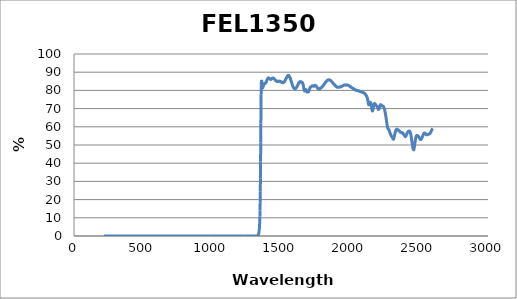
| Category | Series 0 |
|---|---|
| 2600.0 | 59.08 |
| 2599.0 | 58.998 |
| 2598.0 | 58.89 |
| 2597.0 | 58.739 |
| 2596.0 | 58.732 |
| 2595.0 | 58.584 |
| 2594.0 | 58.423 |
| 2593.0 | 58.356 |
| 2592.0 | 58.157 |
| 2591.0 | 58.032 |
| 2590.0 | 57.883 |
| 2589.0 | 57.701 |
| 2588.0 | 57.541 |
| 2587.0 | 57.393 |
| 2586.0 | 57.198 |
| 2585.0 | 56.903 |
| 2584.0 | 56.845 |
| 2583.0 | 56.702 |
| 2582.0 | 56.532 |
| 2581.0 | 56.391 |
| 2580.0 | 56.338 |
| 2579.0 | 56.215 |
| 2578.0 | 56.128 |
| 2577.0 | 56.086 |
| 2576.0 | 56.096 |
| 2575.0 | 56.05 |
| 2574.0 | 55.998 |
| 2573.0 | 56.052 |
| 2572.0 | 56.052 |
| 2571.0 | 55.967 |
| 2570.0 | 55.991 |
| 2569.0 | 55.956 |
| 2568.0 | 55.953 |
| 2567.0 | 55.825 |
| 2566.0 | 55.834 |
| 2565.0 | 55.737 |
| 2564.0 | 55.673 |
| 2563.0 | 55.618 |
| 2562.0 | 55.721 |
| 2561.0 | 55.596 |
| 2560.0 | 55.57 |
| 2559.0 | 55.626 |
| 2558.0 | 55.591 |
| 2557.0 | 55.619 |
| 2556.0 | 55.607 |
| 2555.0 | 55.582 |
| 2554.0 | 55.66 |
| 2553.0 | 55.694 |
| 2552.0 | 55.776 |
| 2551.0 | 55.855 |
| 2550.0 | 55.943 |
| 2549.0 | 56.063 |
| 2548.0 | 56.208 |
| 2547.0 | 56.269 |
| 2546.0 | 56.344 |
| 2545.0 | 56.361 |
| 2544.0 | 56.423 |
| 2543.0 | 56.454 |
| 2542.0 | 56.578 |
| 2541.0 | 56.522 |
| 2540.0 | 56.527 |
| 2539.0 | 56.511 |
| 2538.0 | 56.524 |
| 2537.0 | 56.357 |
| 2536.0 | 56.397 |
| 2535.0 | 56.24 |
| 2534.0 | 56.103 |
| 2533.0 | 55.975 |
| 2532.0 | 55.994 |
| 2531.0 | 55.673 |
| 2530.0 | 55.518 |
| 2529.0 | 55.333 |
| 2528.0 | 55.132 |
| 2527.0 | 54.967 |
| 2526.0 | 54.809 |
| 2525.0 | 54.567 |
| 2524.0 | 54.397 |
| 2523.0 | 54.203 |
| 2522.0 | 54.044 |
| 2521.0 | 53.843 |
| 2520.0 | 53.65 |
| 2519.0 | 53.543 |
| 2518.0 | 53.363 |
| 2517.0 | 53.265 |
| 2516.0 | 53.142 |
| 2515.0 | 53.128 |
| 2514.0 | 52.998 |
| 2513.0 | 52.995 |
| 2512.0 | 53.062 |
| 2511.0 | 53.072 |
| 2510.0 | 53.024 |
| 2509.0 | 53.196 |
| 2508.0 | 53.247 |
| 2507.0 | 53.301 |
| 2506.0 | 53.443 |
| 2505.0 | 53.642 |
| 2504.0 | 53.713 |
| 2503.0 | 53.88 |
| 2502.0 | 54.003 |
| 2501.0 | 54.151 |
| 2500.0 | 54.252 |
| 2499.0 | 54.462 |
| 2498.0 | 54.479 |
| 2497.0 | 54.494 |
| 2496.0 | 54.653 |
| 2495.0 | 54.744 |
| 2494.0 | 54.746 |
| 2493.0 | 54.863 |
| 2492.0 | 54.967 |
| 2491.0 | 54.987 |
| 2490.0 | 55.009 |
| 2489.0 | 55.04 |
| 2488.0 | 55.151 |
| 2487.0 | 55.133 |
| 2486.0 | 55.208 |
| 2485.0 | 55.249 |
| 2484.0 | 55.218 |
| 2483.0 | 55.239 |
| 2482.0 | 55.121 |
| 2481.0 | 54.965 |
| 2480.0 | 54.857 |
| 2479.0 | 54.671 |
| 2478.0 | 54.383 |
| 2477.0 | 54.024 |
| 2476.0 | 53.673 |
| 2475.0 | 53.316 |
| 2474.0 | 52.816 |
| 2473.0 | 52.386 |
| 2472.0 | 51.907 |
| 2471.0 | 51.385 |
| 2470.0 | 50.871 |
| 2469.0 | 50.351 |
| 2468.0 | 49.699 |
| 2467.0 | 49.206 |
| 2466.0 | 48.757 |
| 2465.0 | 48.279 |
| 2464.0 | 47.858 |
| 2463.0 | 47.6 |
| 2462.0 | 47.439 |
| 2461.0 | 47.316 |
| 2460.0 | 47.384 |
| 2459.0 | 47.467 |
| 2458.0 | 47.709 |
| 2457.0 | 47.986 |
| 2456.0 | 48.345 |
| 2455.0 | 48.731 |
| 2454.0 | 49.183 |
| 2453.0 | 49.575 |
| 2452.0 | 50.059 |
| 2451.0 | 50.507 |
| 2450.0 | 51.056 |
| 2449.0 | 51.544 |
| 2448.0 | 52.054 |
| 2447.0 | 52.669 |
| 2446.0 | 53.086 |
| 2445.0 | 53.676 |
| 2444.0 | 54.155 |
| 2443.0 | 54.662 |
| 2442.0 | 55.085 |
| 2441.0 | 55.628 |
| 2440.0 | 55.973 |
| 2439.0 | 56.266 |
| 2438.0 | 56.589 |
| 2437.0 | 56.837 |
| 2436.0 | 56.959 |
| 2435.0 | 57.193 |
| 2434.0 | 57.366 |
| 2433.0 | 57.435 |
| 2432.0 | 57.477 |
| 2431.0 | 57.651 |
| 2430.0 | 57.554 |
| 2429.0 | 57.632 |
| 2428.0 | 57.688 |
| 2427.0 | 57.633 |
| 2426.0 | 57.532 |
| 2425.0 | 57.519 |
| 2424.0 | 57.449 |
| 2423.0 | 57.473 |
| 2422.0 | 57.356 |
| 2421.0 | 57.287 |
| 2420.0 | 57.161 |
| 2419.0 | 57.169 |
| 2418.0 | 57.008 |
| 2417.0 | 56.905 |
| 2416.0 | 56.818 |
| 2415.0 | 56.636 |
| 2414.0 | 56.464 |
| 2413.0 | 56.378 |
| 2412.0 | 56.252 |
| 2411.0 | 55.966 |
| 2410.0 | 55.765 |
| 2409.0 | 55.601 |
| 2408.0 | 55.36 |
| 2407.0 | 55.206 |
| 2406.0 | 55.034 |
| 2405.0 | 54.823 |
| 2404.0 | 54.762 |
| 2403.0 | 54.758 |
| 2402.0 | 54.606 |
| 2401.0 | 54.626 |
| 2400.0 | 54.759 |
| 2399.0 | 54.757 |
| 2398.0 | 54.826 |
| 2397.0 | 55.039 |
| 2396.0 | 55.105 |
| 2395.0 | 55.207 |
| 2394.0 | 55.368 |
| 2393.0 | 55.439 |
| 2392.0 | 55.473 |
| 2391.0 | 55.654 |
| 2390.0 | 55.697 |
| 2389.0 | 55.815 |
| 2388.0 | 55.918 |
| 2387.0 | 56.036 |
| 2386.0 | 56.025 |
| 2385.0 | 56.229 |
| 2384.0 | 56.36 |
| 2383.0 | 56.444 |
| 2382.0 | 56.583 |
| 2381.0 | 56.614 |
| 2380.0 | 56.64 |
| 2379.0 | 56.732 |
| 2378.0 | 56.728 |
| 2377.0 | 56.735 |
| 2376.0 | 56.827 |
| 2375.0 | 56.801 |
| 2374.0 | 56.763 |
| 2373.0 | 56.787 |
| 2372.0 | 56.759 |
| 2371.0 | 56.779 |
| 2370.0 | 56.847 |
| 2369.0 | 56.849 |
| 2368.0 | 56.871 |
| 2367.0 | 56.918 |
| 2366.0 | 56.978 |
| 2365.0 | 56.98 |
| 2364.0 | 57.125 |
| 2363.0 | 57.138 |
| 2362.0 | 57.322 |
| 2361.0 | 57.549 |
| 2360.0 | 57.591 |
| 2359.0 | 57.69 |
| 2358.0 | 57.821 |
| 2357.0 | 57.858 |
| 2356.0 | 57.951 |
| 2355.0 | 58.063 |
| 2354.0 | 58.008 |
| 2353.0 | 57.978 |
| 2352.0 | 58.069 |
| 2351.0 | 58.042 |
| 2350.0 | 58.04 |
| 2349.0 | 58.071 |
| 2348.0 | 58.071 |
| 2347.0 | 58.253 |
| 2346.0 | 58.362 |
| 2345.0 | 58.418 |
| 2344.0 | 58.416 |
| 2343.0 | 58.623 |
| 2342.0 | 58.605 |
| 2341.0 | 58.723 |
| 2340.0 | 58.75 |
| 2339.0 | 58.725 |
| 2338.0 | 58.627 |
| 2337.0 | 58.568 |
| 2336.0 | 58.468 |
| 2335.0 | 58.38 |
| 2334.0 | 58.271 |
| 2333.0 | 58.04 |
| 2332.0 | 57.912 |
| 2331.0 | 57.774 |
| 2330.0 | 57.429 |
| 2329.0 | 57.296 |
| 2328.0 | 57.086 |
| 2327.0 | 56.75 |
| 2326.0 | 56.537 |
| 2325.0 | 56.218 |
| 2324.0 | 55.95 |
| 2323.0 | 55.571 |
| 2322.0 | 55.213 |
| 2321.0 | 54.843 |
| 2320.0 | 54.405 |
| 2319.0 | 54.035 |
| 2318.0 | 53.629 |
| 2317.0 | 53.412 |
| 2316.0 | 53.283 |
| 2315.0 | 53.118 |
| 2314.0 | 53.136 |
| 2313.0 | 53.224 |
| 2312.0 | 53.272 |
| 2311.0 | 53.464 |
| 2310.0 | 53.692 |
| 2309.0 | 53.871 |
| 2308.0 | 54.096 |
| 2307.0 | 54.277 |
| 2306.0 | 54.322 |
| 2305.0 | 54.454 |
| 2304.0 | 54.565 |
| 2303.0 | 54.606 |
| 2302.0 | 54.622 |
| 2301.0 | 54.724 |
| 2300.0 | 54.883 |
| 2299.0 | 54.96 |
| 2298.0 | 55.14 |
| 2297.0 | 55.264 |
| 2296.0 | 55.474 |
| 2295.0 | 55.62 |
| 2294.0 | 55.876 |
| 2293.0 | 56.095 |
| 2292.0 | 56.32 |
| 2291.0 | 56.464 |
| 2290.0 | 56.661 |
| 2289.0 | 56.918 |
| 2288.0 | 57.043 |
| 2287.0 | 57.268 |
| 2286.0 | 57.557 |
| 2285.0 | 57.739 |
| 2284.0 | 57.981 |
| 2283.0 | 58.205 |
| 2282.0 | 58.319 |
| 2281.0 | 58.477 |
| 2280.0 | 58.555 |
| 2279.0 | 58.729 |
| 2278.0 | 58.724 |
| 2277.0 | 58.84 |
| 2276.0 | 58.892 |
| 2275.0 | 59.089 |
| 2274.0 | 59.252 |
| 2273.0 | 59.306 |
| 2272.0 | 59.713 |
| 2271.0 | 60.044 |
| 2270.0 | 60.431 |
| 2269.0 | 60.901 |
| 2268.0 | 61.445 |
| 2267.0 | 61.992 |
| 2266.0 | 62.46 |
| 2265.0 | 62.979 |
| 2264.0 | 63.509 |
| 2263.0 | 64.086 |
| 2262.0 | 64.629 |
| 2261.0 | 65.035 |
| 2260.0 | 65.577 |
| 2259.0 | 66.095 |
| 2258.0 | 66.543 |
| 2257.0 | 67.045 |
| 2256.0 | 67.435 |
| 2255.0 | 67.853 |
| 2254.0 | 68.217 |
| 2253.0 | 68.553 |
| 2252.0 | 68.901 |
| 2251.0 | 69.326 |
| 2250.0 | 69.617 |
| 2249.0 | 69.903 |
| 2248.0 | 70.182 |
| 2247.0 | 70.359 |
| 2246.0 | 70.544 |
| 2245.0 | 70.719 |
| 2244.0 | 70.915 |
| 2243.0 | 71.1 |
| 2242.0 | 71.116 |
| 2241.0 | 71.195 |
| 2240.0 | 71.291 |
| 2239.0 | 71.299 |
| 2238.0 | 71.284 |
| 2237.0 | 71.406 |
| 2236.0 | 71.417 |
| 2235.0 | 71.419 |
| 2234.0 | 71.378 |
| 2233.0 | 71.424 |
| 2232.0 | 71.574 |
| 2231.0 | 71.552 |
| 2230.0 | 71.581 |
| 2229.0 | 71.651 |
| 2228.0 | 71.78 |
| 2227.0 | 71.817 |
| 2226.0 | 71.978 |
| 2225.0 | 72.048 |
| 2224.0 | 72.082 |
| 2223.0 | 72.09 |
| 2222.0 | 72.177 |
| 2221.0 | 72.104 |
| 2220.0 | 71.931 |
| 2219.0 | 71.886 |
| 2218.0 | 71.634 |
| 2217.0 | 71.493 |
| 2216.0 | 71.216 |
| 2215.0 | 70.965 |
| 2214.0 | 70.558 |
| 2213.0 | 70.431 |
| 2212.0 | 70.057 |
| 2211.0 | 69.916 |
| 2210.0 | 69.734 |
| 2209.0 | 69.619 |
| 2208.0 | 69.549 |
| 2207.0 | 69.568 |
| 2206.0 | 69.593 |
| 2205.0 | 69.603 |
| 2204.0 | 69.849 |
| 2203.0 | 69.976 |
| 2202.0 | 70.247 |
| 2201.0 | 70.439 |
| 2200.0 | 70.683 |
| 2199.0 | 70.769 |
| 2198.0 | 71.028 |
| 2197.0 | 71.208 |
| 2196.0 | 71.253 |
| 2195.0 | 71.37 |
| 2194.0 | 71.366 |
| 2193.0 | 71.512 |
| 2192.0 | 71.563 |
| 2191.0 | 71.634 |
| 2190.0 | 71.711 |
| 2189.0 | 71.775 |
| 2188.0 | 71.827 |
| 2187.0 | 71.907 |
| 2186.0 | 72.046 |
| 2185.0 | 72.139 |
| 2184.0 | 72.451 |
| 2183.0 | 72.412 |
| 2182.0 | 72.627 |
| 2181.0 | 72.623 |
| 2180.0 | 72.718 |
| 2179.0 | 72.762 |
| 2178.0 | 72.76 |
| 2177.0 | 72.817 |
| 2176.0 | 72.754 |
| 2175.0 | 72.533 |
| 2174.0 | 72.391 |
| 2173.0 | 72.122 |
| 2172.0 | 71.85 |
| 2171.0 | 71.518 |
| 2170.0 | 70.978 |
| 2169.0 | 70.607 |
| 2168.0 | 70.104 |
| 2167.0 | 69.62 |
| 2166.0 | 69.238 |
| 2165.0 | 68.917 |
| 2164.0 | 68.854 |
| 2163.0 | 68.704 |
| 2162.0 | 68.758 |
| 2161.0 | 68.972 |
| 2160.0 | 69.312 |
| 2159.0 | 69.717 |
| 2158.0 | 70.134 |
| 2157.0 | 70.598 |
| 2156.0 | 71.098 |
| 2155.0 | 71.468 |
| 2154.0 | 71.884 |
| 2153.0 | 72.274 |
| 2152.0 | 72.678 |
| 2151.0 | 72.932 |
| 2150.0 | 73.163 |
| 2149.0 | 73.283 |
| 2148.0 | 73.386 |
| 2147.0 | 73.478 |
| 2146.0 | 73.345 |
| 2145.0 | 73.352 |
| 2144.0 | 73.208 |
| 2143.0 | 73.005 |
| 2142.0 | 72.804 |
| 2141.0 | 72.673 |
| 2140.0 | 72.356 |
| 2139.0 | 72.309 |
| 2138.0 | 72.071 |
| 2137.0 | 72.036 |
| 2136.0 | 72.096 |
| 2135.0 | 72.156 |
| 2134.0 | 72.509 |
| 2133.0 | 72.8 |
| 2132.0 | 73.242 |
| 2131.0 | 73.582 |
| 2130.0 | 74.133 |
| 2129.0 | 74.646 |
| 2128.0 | 75.01 |
| 2127.0 | 75.4 |
| 2126.0 | 75.733 |
| 2125.0 | 75.971 |
| 2124.0 | 76.161 |
| 2123.0 | 76.386 |
| 2122.0 | 76.566 |
| 2121.0 | 76.767 |
| 2120.0 | 76.938 |
| 2119.0 | 76.933 |
| 2118.0 | 77.129 |
| 2117.0 | 77.185 |
| 2116.0 | 77.488 |
| 2115.0 | 77.451 |
| 2114.0 | 77.653 |
| 2113.0 | 77.751 |
| 2112.0 | 77.898 |
| 2111.0 | 77.862 |
| 2110.0 | 78.048 |
| 2109.0 | 78.188 |
| 2108.0 | 78.213 |
| 2107.0 | 78.235 |
| 2106.0 | 78.239 |
| 2105.0 | 78.369 |
| 2104.0 | 78.466 |
| 2103.0 | 78.532 |
| 2102.0 | 78.582 |
| 2101.0 | 78.617 |
| 2100.0 | 78.656 |
| 2099.0 | 78.688 |
| 2098.0 | 78.743 |
| 2097.0 | 78.757 |
| 2096.0 | 78.755 |
| 2095.0 | 78.845 |
| 2094.0 | 78.77 |
| 2093.0 | 78.954 |
| 2092.0 | 78.859 |
| 2091.0 | 78.912 |
| 2090.0 | 78.89 |
| 2089.0 | 78.985 |
| 2088.0 | 79.024 |
| 2087.0 | 79.051 |
| 2086.0 | 79.04 |
| 2085.0 | 79.049 |
| 2084.0 | 79.107 |
| 2083.0 | 79.105 |
| 2082.0 | 79.102 |
| 2081.0 | 79.147 |
| 2080.0 | 79.182 |
| 2079.0 | 79.21 |
| 2078.0 | 79.283 |
| 2077.0 | 79.373 |
| 2076.0 | 79.343 |
| 2075.0 | 79.334 |
| 2074.0 | 79.376 |
| 2073.0 | 79.402 |
| 2072.0 | 79.464 |
| 2071.0 | 79.441 |
| 2070.0 | 79.516 |
| 2069.0 | 79.566 |
| 2068.0 | 79.586 |
| 2067.0 | 79.589 |
| 2066.0 | 79.641 |
| 2065.0 | 79.761 |
| 2064.0 | 79.701 |
| 2063.0 | 79.687 |
| 2062.0 | 79.762 |
| 2061.0 | 79.723 |
| 2060.0 | 79.842 |
| 2059.0 | 79.882 |
| 2058.0 | 79.905 |
| 2057.0 | 79.92 |
| 2056.0 | 79.912 |
| 2055.0 | 79.885 |
| 2054.0 | 79.913 |
| 2053.0 | 79.884 |
| 2052.0 | 79.989 |
| 2051.0 | 79.968 |
| 2050.0 | 79.995 |
| 2049.0 | 79.966 |
| 2048.0 | 80.053 |
| 2047.0 | 80.136 |
| 2046.0 | 80.119 |
| 2045.0 | 80.051 |
| 2044.0 | 80.124 |
| 2043.0 | 80.189 |
| 2042.0 | 80.209 |
| 2041.0 | 80.306 |
| 2040.0 | 80.133 |
| 2039.0 | 80.26 |
| 2038.0 | 80.343 |
| 2037.0 | 80.395 |
| 2036.0 | 80.375 |
| 2035.0 | 80.548 |
| 2034.0 | 80.55 |
| 2033.0 | 80.618 |
| 2032.0 | 80.569 |
| 2031.0 | 80.687 |
| 2030.0 | 80.729 |
| 2029.0 | 80.856 |
| 2028.0 | 80.752 |
| 2027.0 | 80.9 |
| 2026.0 | 80.958 |
| 2025.0 | 80.94 |
| 2024.0 | 80.998 |
| 2023.0 | 80.927 |
| 2022.0 | 81.151 |
| 2021.0 | 81.152 |
| 2020.0 | 81.126 |
| 2019.0 | 81.265 |
| 2018.0 | 81.26 |
| 2017.0 | 81.332 |
| 2016.0 | 81.415 |
| 2015.0 | 81.422 |
| 2014.0 | 81.543 |
| 2013.0 | 81.522 |
| 2012.0 | 81.541 |
| 2011.0 | 81.584 |
| 2010.0 | 81.62 |
| 2009.0 | 81.745 |
| 2008.0 | 81.728 |
| 2007.0 | 81.894 |
| 2006.0 | 81.832 |
| 2005.0 | 82.012 |
| 2004.0 | 81.999 |
| 2003.0 | 81.921 |
| 2002.0 | 81.994 |
| 2001.0 | 82.127 |
| 2000.0 | 82.191 |
| 1999.0 | 82.332 |
| 1998.0 | 82.314 |
| 1997.0 | 82.342 |
| 1996.0 | 82.365 |
| 1995.0 | 82.446 |
| 1994.0 | 82.509 |
| 1993.0 | 82.474 |
| 1992.0 | 82.572 |
| 1991.0 | 82.652 |
| 1990.0 | 82.693 |
| 1989.0 | 82.754 |
| 1988.0 | 82.745 |
| 1987.0 | 82.763 |
| 1986.0 | 82.8 |
| 1985.0 | 82.853 |
| 1984.0 | 82.895 |
| 1983.0 | 82.881 |
| 1982.0 | 82.878 |
| 1981.0 | 83.022 |
| 1980.0 | 82.938 |
| 1979.0 | 82.958 |
| 1978.0 | 83.024 |
| 1977.0 | 82.901 |
| 1976.0 | 82.949 |
| 1975.0 | 82.95 |
| 1974.0 | 82.997 |
| 1973.0 | 82.891 |
| 1972.0 | 83.005 |
| 1971.0 | 82.974 |
| 1970.0 | 83.05 |
| 1969.0 | 82.904 |
| 1968.0 | 82.93 |
| 1967.0 | 83.025 |
| 1966.0 | 82.955 |
| 1965.0 | 82.914 |
| 1964.0 | 82.915 |
| 1963.0 | 82.939 |
| 1962.0 | 82.918 |
| 1961.0 | 82.895 |
| 1960.0 | 82.884 |
| 1959.0 | 82.933 |
| 1958.0 | 82.899 |
| 1957.0 | 82.883 |
| 1956.0 | 82.831 |
| 1955.0 | 82.807 |
| 1954.0 | 82.811 |
| 1953.0 | 82.731 |
| 1952.0 | 82.724 |
| 1951.0 | 82.668 |
| 1950.0 | 82.681 |
| 1949.0 | 82.668 |
| 1948.0 | 82.545 |
| 1947.0 | 82.512 |
| 1946.0 | 82.53 |
| 1945.0 | 82.416 |
| 1944.0 | 82.381 |
| 1943.0 | 82.398 |
| 1942.0 | 82.392 |
| 1941.0 | 82.202 |
| 1940.0 | 82.259 |
| 1939.0 | 82.189 |
| 1938.0 | 82.149 |
| 1937.0 | 82.196 |
| 1936.0 | 82.016 |
| 1935.0 | 82.087 |
| 1934.0 | 82.007 |
| 1933.0 | 82.068 |
| 1932.0 | 81.953 |
| 1931.0 | 81.964 |
| 1930.0 | 81.849 |
| 1929.0 | 81.866 |
| 1928.0 | 81.849 |
| 1927.0 | 81.848 |
| 1926.0 | 81.802 |
| 1925.0 | 81.863 |
| 1924.0 | 81.855 |
| 1923.0 | 81.677 |
| 1922.0 | 81.831 |
| 1921.0 | 81.72 |
| 1920.0 | 81.683 |
| 1919.0 | 81.782 |
| 1918.0 | 81.754 |
| 1917.0 | 81.691 |
| 1916.0 | 81.692 |
| 1915.0 | 81.73 |
| 1914.0 | 81.72 |
| 1913.0 | 81.652 |
| 1912.0 | 81.716 |
| 1911.0 | 81.715 |
| 1910.0 | 81.746 |
| 1909.0 | 81.784 |
| 1908.0 | 81.815 |
| 1907.0 | 81.817 |
| 1906.0 | 81.775 |
| 1905.0 | 81.865 |
| 1904.0 | 81.898 |
| 1903.0 | 81.981 |
| 1902.0 | 81.951 |
| 1901.0 | 82.033 |
| 1900.0 | 82.16 |
| 1899.0 | 82.263 |
| 1898.0 | 82.201 |
| 1897.0 | 82.38 |
| 1896.0 | 82.304 |
| 1895.0 | 82.431 |
| 1894.0 | 82.573 |
| 1893.0 | 82.709 |
| 1892.0 | 82.716 |
| 1891.0 | 82.762 |
| 1890.0 | 82.88 |
| 1889.0 | 83.026 |
| 1888.0 | 83.095 |
| 1887.0 | 83.133 |
| 1886.0 | 83.133 |
| 1885.0 | 83.304 |
| 1884.0 | 83.312 |
| 1883.0 | 83.42 |
| 1882.0 | 83.583 |
| 1881.0 | 83.701 |
| 1880.0 | 83.712 |
| 1879.0 | 83.81 |
| 1878.0 | 83.927 |
| 1877.0 | 83.903 |
| 1876.0 | 84.167 |
| 1875.0 | 84.157 |
| 1874.0 | 84.26 |
| 1873.0 | 84.346 |
| 1872.0 | 84.417 |
| 1871.0 | 84.48 |
| 1870.0 | 84.625 |
| 1869.0 | 84.689 |
| 1868.0 | 84.772 |
| 1867.0 | 84.879 |
| 1866.0 | 84.995 |
| 1865.0 | 85.08 |
| 1864.0 | 85.062 |
| 1863.0 | 85.26 |
| 1862.0 | 85.264 |
| 1861.0 | 85.335 |
| 1860.0 | 85.348 |
| 1859.0 | 85.481 |
| 1858.0 | 85.501 |
| 1857.0 | 85.576 |
| 1856.0 | 85.59 |
| 1855.0 | 85.652 |
| 1854.0 | 85.611 |
| 1853.0 | 85.73 |
| 1852.0 | 85.649 |
| 1851.0 | 85.728 |
| 1850.0 | 85.856 |
| 1849.0 | 85.785 |
| 1848.0 | 85.885 |
| 1847.0 | 85.707 |
| 1846.0 | 85.756 |
| 1845.0 | 85.78 |
| 1844.0 | 85.732 |
| 1843.0 | 85.725 |
| 1842.0 | 85.735 |
| 1841.0 | 85.748 |
| 1840.0 | 85.767 |
| 1839.0 | 85.605 |
| 1838.0 | 85.546 |
| 1837.0 | 85.615 |
| 1836.0 | 85.525 |
| 1835.0 | 85.436 |
| 1834.0 | 85.441 |
| 1833.0 | 85.279 |
| 1832.0 | 85.254 |
| 1831.0 | 85.037 |
| 1830.0 | 85.072 |
| 1829.0 | 84.957 |
| 1828.0 | 84.84 |
| 1827.0 | 84.686 |
| 1826.0 | 84.697 |
| 1825.0 | 84.63 |
| 1824.0 | 84.615 |
| 1823.0 | 84.544 |
| 1822.0 | 84.326 |
| 1821.0 | 84.298 |
| 1820.0 | 84.188 |
| 1819.0 | 84.115 |
| 1818.0 | 83.883 |
| 1817.0 | 83.826 |
| 1816.0 | 83.738 |
| 1815.0 | 83.58 |
| 1814.0 | 83.588 |
| 1813.0 | 83.44 |
| 1812.0 | 83.294 |
| 1811.0 | 83.176 |
| 1810.0 | 83.081 |
| 1809.0 | 83.077 |
| 1808.0 | 83.021 |
| 1807.0 | 82.756 |
| 1806.0 | 82.603 |
| 1805.0 | 82.515 |
| 1804.0 | 82.497 |
| 1803.0 | 82.394 |
| 1802.0 | 82.263 |
| 1801.0 | 82.152 |
| 1800.0 | 82.057 |
| 1799.0 | 82.035 |
| 1798.0 | 81.906 |
| 1797.0 | 81.85 |
| 1796.0 | 81.842 |
| 1795.0 | 81.719 |
| 1794.0 | 81.619 |
| 1793.0 | 81.565 |
| 1792.0 | 81.418 |
| 1791.0 | 81.444 |
| 1790.0 | 81.329 |
| 1789.0 | 81.384 |
| 1788.0 | 81.329 |
| 1787.0 | 81.206 |
| 1786.0 | 81.226 |
| 1785.0 | 81.087 |
| 1784.0 | 81.131 |
| 1783.0 | 81.122 |
| 1782.0 | 81.013 |
| 1781.0 | 81.051 |
| 1780.0 | 81.091 |
| 1779.0 | 80.939 |
| 1778.0 | 80.886 |
| 1777.0 | 80.873 |
| 1776.0 | 80.816 |
| 1775.0 | 80.799 |
| 1774.0 | 80.91 |
| 1773.0 | 80.891 |
| 1772.0 | 80.853 |
| 1771.0 | 80.832 |
| 1770.0 | 80.781 |
| 1769.0 | 80.958 |
| 1768.0 | 80.949 |
| 1767.0 | 81.063 |
| 1766.0 | 81.187 |
| 1765.0 | 81.25 |
| 1764.0 | 81.346 |
| 1763.0 | 81.532 |
| 1762.0 | 81.673 |
| 1761.0 | 81.741 |
| 1760.0 | 81.779 |
| 1759.0 | 81.922 |
| 1758.0 | 82.131 |
| 1757.0 | 82.237 |
| 1756.0 | 82.306 |
| 1755.0 | 82.396 |
| 1754.0 | 82.459 |
| 1753.0 | 82.475 |
| 1752.0 | 82.594 |
| 1751.0 | 82.504 |
| 1750.0 | 82.691 |
| 1749.0 | 82.769 |
| 1748.0 | 82.771 |
| 1747.0 | 82.575 |
| 1746.0 | 82.764 |
| 1745.0 | 82.656 |
| 1744.0 | 82.569 |
| 1743.0 | 82.601 |
| 1742.0 | 82.492 |
| 1741.0 | 82.386 |
| 1740.0 | 82.368 |
| 1739.0 | 82.313 |
| 1738.0 | 82.273 |
| 1737.0 | 82.376 |
| 1736.0 | 82.382 |
| 1735.0 | 82.368 |
| 1734.0 | 82.353 |
| 1733.0 | 82.358 |
| 1732.0 | 82.377 |
| 1731.0 | 82.537 |
| 1730.0 | 82.479 |
| 1729.0 | 82.52 |
| 1728.0 | 82.543 |
| 1727.0 | 82.512 |
| 1726.0 | 82.467 |
| 1725.0 | 82.365 |
| 1724.0 | 82.424 |
| 1723.0 | 82.286 |
| 1722.0 | 82.227 |
| 1721.0 | 82.179 |
| 1720.0 | 82.059 |
| 1719.0 | 82.023 |
| 1718.0 | 81.991 |
| 1717.0 | 82.069 |
| 1716.0 | 81.944 |
| 1715.0 | 81.979 |
| 1714.0 | 81.842 |
| 1713.0 | 81.819 |
| 1712.0 | 81.588 |
| 1711.0 | 81.509 |
| 1710.0 | 81.338 |
| 1709.0 | 81.18 |
| 1708.0 | 81.135 |
| 1707.0 | 80.817 |
| 1706.0 | 80.652 |
| 1705.0 | 80.399 |
| 1704.0 | 80.094 |
| 1703.0 | 79.807 |
| 1702.0 | 79.743 |
| 1701.0 | 79.402 |
| 1700.0 | 79.283 |
| 1699.0 | 79.235 |
| 1698.0 | 79.123 |
| 1697.0 | 79.259 |
| 1696.0 | 79.328 |
| 1695.0 | 79.39 |
| 1694.0 | 79.331 |
| 1693.0 | 79.337 |
| 1692.0 | 79.175 |
| 1691.0 | 79.209 |
| 1690.0 | 79.153 |
| 1689.0 | 79.18 |
| 1688.0 | 79.136 |
| 1687.0 | 79.244 |
| 1686.0 | 79.381 |
| 1685.0 | 79.65 |
| 1684.0 | 79.847 |
| 1683.0 | 79.992 |
| 1682.0 | 80.26 |
| 1681.0 | 80.39 |
| 1680.0 | 80.472 |
| 1679.0 | 80.467 |
| 1678.0 | 80.439 |
| 1677.0 | 80.372 |
| 1676.0 | 80.246 |
| 1675.0 | 80.041 |
| 1674.0 | 79.952 |
| 1673.0 | 79.859 |
| 1672.0 | 79.854 |
| 1671.0 | 79.605 |
| 1670.0 | 79.836 |
| 1669.0 | 79.891 |
| 1668.0 | 80.035 |
| 1667.0 | 80.333 |
| 1666.0 | 80.785 |
| 1665.0 | 81.259 |
| 1664.0 | 81.712 |
| 1663.0 | 82.211 |
| 1662.0 | 82.626 |
| 1661.0 | 82.959 |
| 1660.0 | 83.28 |
| 1659.0 | 83.616 |
| 1658.0 | 83.823 |
| 1657.0 | 83.946 |
| 1656.0 | 84.231 |
| 1655.0 | 84.265 |
| 1654.0 | 84.324 |
| 1653.0 | 84.384 |
| 1652.0 | 84.447 |
| 1651.0 | 84.49 |
| 1650.0 | 84.389 |
| 1649.0 | 84.355 |
| 1648.0 | 84.475 |
| 1647.0 | 84.402 |
| 1646.0 | 84.589 |
| 1645.0 | 84.54 |
| 1644.0 | 84.685 |
| 1643.0 | 84.712 |
| 1642.0 | 84.915 |
| 1641.0 | 84.846 |
| 1640.0 | 84.899 |
| 1639.0 | 84.851 |
| 1638.0 | 84.812 |
| 1637.0 | 84.756 |
| 1636.0 | 84.68 |
| 1635.0 | 84.614 |
| 1634.0 | 84.562 |
| 1633.0 | 84.359 |
| 1632.0 | 84.329 |
| 1631.0 | 84.346 |
| 1630.0 | 84.09 |
| 1629.0 | 84.131 |
| 1628.0 | 83.885 |
| 1627.0 | 83.858 |
| 1626.0 | 83.617 |
| 1625.0 | 83.525 |
| 1624.0 | 83.313 |
| 1623.0 | 83.157 |
| 1622.0 | 82.995 |
| 1621.0 | 82.829 |
| 1620.0 | 82.68 |
| 1619.0 | 82.561 |
| 1618.0 | 82.306 |
| 1617.0 | 82.168 |
| 1616.0 | 82.064 |
| 1615.0 | 81.953 |
| 1614.0 | 81.806 |
| 1613.0 | 81.76 |
| 1612.0 | 81.559 |
| 1611.0 | 81.421 |
| 1610.0 | 81.399 |
| 1609.0 | 81.392 |
| 1608.0 | 81.201 |
| 1607.0 | 81.099 |
| 1606.0 | 81.003 |
| 1605.0 | 80.889 |
| 1604.0 | 80.923 |
| 1603.0 | 80.956 |
| 1602.0 | 80.942 |
| 1601.0 | 80.881 |
| 1600.0 | 80.979 |
| 1599.0 | 80.924 |
| 1598.0 | 80.983 |
| 1597.0 | 81.094 |
| 1596.0 | 81.039 |
| 1595.0 | 81.093 |
| 1594.0 | 81.277 |
| 1593.0 | 81.244 |
| 1592.0 | 81.3 |
| 1591.0 | 81.545 |
| 1590.0 | 81.632 |
| 1589.0 | 81.781 |
| 1588.0 | 81.946 |
| 1587.0 | 82.117 |
| 1586.0 | 82.262 |
| 1585.0 | 82.475 |
| 1584.0 | 82.684 |
| 1583.0 | 82.903 |
| 1582.0 | 83.11 |
| 1581.0 | 83.38 |
| 1580.0 | 83.555 |
| 1579.0 | 83.819 |
| 1578.0 | 84.127 |
| 1577.0 | 84.361 |
| 1576.0 | 84.488 |
| 1575.0 | 84.83 |
| 1574.0 | 85.149 |
| 1573.0 | 85.32 |
| 1572.0 | 85.439 |
| 1571.0 | 85.796 |
| 1570.0 | 86.127 |
| 1569.0 | 86.225 |
| 1568.0 | 86.347 |
| 1567.0 | 86.629 |
| 1566.0 | 86.886 |
| 1565.0 | 87.081 |
| 1564.0 | 87.185 |
| 1563.0 | 87.383 |
| 1562.0 | 87.522 |
| 1561.0 | 87.62 |
| 1560.0 | 87.833 |
| 1559.0 | 87.891 |
| 1558.0 | 87.933 |
| 1557.0 | 88.081 |
| 1556.0 | 88.231 |
| 1555.0 | 88.127 |
| 1554.0 | 88.215 |
| 1553.0 | 88.201 |
| 1552.0 | 88.262 |
| 1551.0 | 88.132 |
| 1550.0 | 88.118 |
| 1549.0 | 88.011 |
| 1548.0 | 87.968 |
| 1547.0 | 87.977 |
| 1546.0 | 87.816 |
| 1545.0 | 87.607 |
| 1544.0 | 87.562 |
| 1543.0 | 87.385 |
| 1542.0 | 87.162 |
| 1541.0 | 87.09 |
| 1540.0 | 86.983 |
| 1539.0 | 86.819 |
| 1538.0 | 86.629 |
| 1537.0 | 86.493 |
| 1536.0 | 86.417 |
| 1535.0 | 86.243 |
| 1534.0 | 86.116 |
| 1533.0 | 85.889 |
| 1532.0 | 85.804 |
| 1531.0 | 85.633 |
| 1530.0 | 85.525 |
| 1529.0 | 85.41 |
| 1528.0 | 85.183 |
| 1527.0 | 85.095 |
| 1526.0 | 84.959 |
| 1525.0 | 84.879 |
| 1524.0 | 84.703 |
| 1523.0 | 84.634 |
| 1522.0 | 84.514 |
| 1521.0 | 84.574 |
| 1520.0 | 84.517 |
| 1519.0 | 84.485 |
| 1518.0 | 84.348 |
| 1517.0 | 84.348 |
| 1516.0 | 84.466 |
| 1515.0 | 84.202 |
| 1514.0 | 84.294 |
| 1513.0 | 84.321 |
| 1512.0 | 84.304 |
| 1511.0 | 84.321 |
| 1510.0 | 84.351 |
| 1509.0 | 84.396 |
| 1508.0 | 84.359 |
| 1507.0 | 84.371 |
| 1506.0 | 84.484 |
| 1505.0 | 84.528 |
| 1504.0 | 84.495 |
| 1503.0 | 84.649 |
| 1502.0 | 84.608 |
| 1501.0 | 84.662 |
| 1500.0 | 84.742 |
| 1499.0 | 84.811 |
| 1498.0 | 84.762 |
| 1497.0 | 84.839 |
| 1496.0 | 84.795 |
| 1495.0 | 84.939 |
| 1494.0 | 84.997 |
| 1493.0 | 84.899 |
| 1492.0 | 85.028 |
| 1491.0 | 84.947 |
| 1490.0 | 85.047 |
| 1489.0 | 85.05 |
| 1488.0 | 85.04 |
| 1487.0 | 85.043 |
| 1486.0 | 85.069 |
| 1485.0 | 85.075 |
| 1484.0 | 85.095 |
| 1483.0 | 84.984 |
| 1482.0 | 85.109 |
| 1481.0 | 84.969 |
| 1480.0 | 84.933 |
| 1479.0 | 84.948 |
| 1478.0 | 84.986 |
| 1477.0 | 84.977 |
| 1476.0 | 84.968 |
| 1475.0 | 85.049 |
| 1474.0 | 84.921 |
| 1473.0 | 84.954 |
| 1472.0 | 85.036 |
| 1471.0 | 84.861 |
| 1470.0 | 84.92 |
| 1469.0 | 84.986 |
| 1468.0 | 85.089 |
| 1467.0 | 85.166 |
| 1466.0 | 85.175 |
| 1465.0 | 85.186 |
| 1464.0 | 85.234 |
| 1463.0 | 85.382 |
| 1462.0 | 85.34 |
| 1461.0 | 85.355 |
| 1460.0 | 85.514 |
| 1459.0 | 85.611 |
| 1458.0 | 85.664 |
| 1457.0 | 85.828 |
| 1456.0 | 85.918 |
| 1455.0 | 85.924 |
| 1454.0 | 86.03 |
| 1453.0 | 86.045 |
| 1452.0 | 86.227 |
| 1451.0 | 86.218 |
| 1450.0 | 86.456 |
| 1449.0 | 86.494 |
| 1448.0 | 86.508 |
| 1447.0 | 86.655 |
| 1446.0 | 86.673 |
| 1445.0 | 86.769 |
| 1444.0 | 86.711 |
| 1443.0 | 86.795 |
| 1442.0 | 86.798 |
| 1441.0 | 86.668 |
| 1440.0 | 86.785 |
| 1439.0 | 86.671 |
| 1438.0 | 86.709 |
| 1437.0 | 86.63 |
| 1436.0 | 86.613 |
| 1435.0 | 86.493 |
| 1434.0 | 86.437 |
| 1433.0 | 86.374 |
| 1432.0 | 86.27 |
| 1431.0 | 86.263 |
| 1430.0 | 86.14 |
| 1429.0 | 86.1 |
| 1428.0 | 86.098 |
| 1427.0 | 86.071 |
| 1426.0 | 86.118 |
| 1425.0 | 86.094 |
| 1424.0 | 86.047 |
| 1423.0 | 86.141 |
| 1422.0 | 86.172 |
| 1421.0 | 86.147 |
| 1420.0 | 86.416 |
| 1419.0 | 86.38 |
| 1418.0 | 86.482 |
| 1417.0 | 86.508 |
| 1416.0 | 86.549 |
| 1415.0 | 86.678 |
| 1414.0 | 86.67 |
| 1413.0 | 86.743 |
| 1412.0 | 86.716 |
| 1411.0 | 86.745 |
| 1410.0 | 86.766 |
| 1409.0 | 86.903 |
| 1408.0 | 86.856 |
| 1407.0 | 86.808 |
| 1406.0 | 86.804 |
| 1405.0 | 86.626 |
| 1404.0 | 86.53 |
| 1403.0 | 86.395 |
| 1402.0 | 86.303 |
| 1401.0 | 86.197 |
| 1400.0 | 85.988 |
| 1399.0 | 85.872 |
| 1398.0 | 85.614 |
| 1397.0 | 85.268 |
| 1396.0 | 85.157 |
| 1395.0 | 85.049 |
| 1394.0 | 84.851 |
| 1393.0 | 84.691 |
| 1392.0 | 84.402 |
| 1391.0 | 84.396 |
| 1390.0 | 84.256 |
| 1389.0 | 84.082 |
| 1388.0 | 84.006 |
| 1387.0 | 84.009 |
| 1386.0 | 83.881 |
| 1385.0 | 83.776 |
| 1384.0 | 83.831 |
| 1383.0 | 83.81 |
| 1382.0 | 83.882 |
| 1381.0 | 83.716 |
| 1380.0 | 83.73 |
| 1379.0 | 83.639 |
| 1378.0 | 83.582 |
| 1377.0 | 83.479 |
| 1376.0 | 83.363 |
| 1375.0 | 83.161 |
| 1374.0 | 82.971 |
| 1373.0 | 82.687 |
| 1372.0 | 82.395 |
| 1371.0 | 82.143 |
| 1370.0 | 81.846 |
| 1369.0 | 81.616 |
| 1368.0 | 81.457 |
| 1367.0 | 81.431 |
| 1366.0 | 81.538 |
| 1365.0 | 81.792 |
| 1364.0 | 82.295 |
| 1363.0 | 83.07 |
| 1362.0 | 83.74 |
| 1361.0 | 84.728 |
| 1360.0 | 85.565 |
| 1359.0 | 85.744 |
| 1358.0 | 84.964 |
| 1357.0 | 82.605 |
| 1356.0 | 77.898 |
| 1355.0 | 70.943 |
| 1354.0 | 61.703 |
| 1353.0 | 51.324 |
| 1352.0 | 40.972 |
| 1351.0 | 31.74 |
| 1350.0 | 24.256 |
| 1349.0 | 18.543 |
| 1348.0 | 14.045 |
| 1347.0 | 10.729 |
| 1346.0 | 8.23 |
| 1345.0 | 6.355 |
| 1344.0 | 4.943 |
| 1343.0 | 4.004 |
| 1342.0 | 3.199 |
| 1341.0 | 2.542 |
| 1340.0 | 1.943 |
| 1339.0 | 1.486 |
| 1338.0 | 1.136 |
| 1337.0 | 0.872 |
| 1336.0 | 0.686 |
| 1335.0 | 0.54 |
| 1334.0 | 0.429 |
| 1333.0 | 0.341 |
| 1332.0 | 0.27 |
| 1331.0 | 0.215 |
| 1330.0 | 0.174 |
| 1329.0 | 0.141 |
| 1328.0 | 0.114 |
| 1327.0 | 0.093 |
| 1326.0 | 0.076 |
| 1325.0 | 0.062 |
| 1324.0 | 0.051 |
| 1323.0 | 0.042 |
| 1322.0 | 0.035 |
| 1321.0 | 0.029 |
| 1320.0 | 0.025 |
| 1319.0 | 0.021 |
| 1318.0 | 0.017 |
| 1317.0 | 0.015 |
| 1316.0 | 0.012 |
| 1315.0 | 0.01 |
| 1314.0 | 0.009 |
| 1313.0 | 0.008 |
| 1312.0 | 0.007 |
| 1311.0 | 0.006 |
| 1310.0 | 0.005 |
| 1309.0 | 0.004 |
| 1308.0 | 0.004 |
| 1307.0 | 0.003 |
| 1306.0 | 0.003 |
| 1305.0 | 0.002 |
| 1304.0 | 0.002 |
| 1303.0 | 0.002 |
| 1302.0 | 0.002 |
| 1301.0 | 0.001 |
| 1300.0 | 0.001 |
| 1299.0 | 0.001 |
| 1298.0 | 0.001 |
| 1297.0 | 0.001 |
| 1296.0 | 0.001 |
| 1295.0 | 0.001 |
| 1294.0 | 0.001 |
| 1293.0 | 0.001 |
| 1292.0 | 0.001 |
| 1291.0 | 0.001 |
| 1290.0 | 0 |
| 1289.0 | 0 |
| 1288.0 | 0 |
| 1287.0 | 0 |
| 1286.0 | 0 |
| 1285.0 | 0 |
| 1284.0 | 0 |
| 1283.0 | 0 |
| 1282.0 | 0 |
| 1281.0 | 0 |
| 1280.0 | 0 |
| 1279.0 | 0 |
| 1278.0 | 0 |
| 1277.0 | 0 |
| 1276.0 | 0 |
| 1275.0 | 0 |
| 1274.0 | 0 |
| 1273.0 | 0 |
| 1272.0 | 0 |
| 1271.0 | 0 |
| 1270.0 | 0 |
| 1269.0 | 0 |
| 1268.0 | 0 |
| 1267.0 | 0 |
| 1266.0 | 0 |
| 1265.0 | 0 |
| 1264.0 | 0 |
| 1263.0 | 0 |
| 1262.0 | 0 |
| 1261.0 | 0 |
| 1260.0 | 0 |
| 1259.0 | 0 |
| 1258.0 | 0 |
| 1257.0 | 0 |
| 1256.0 | 0 |
| 1255.0 | 0 |
| 1254.0 | 0 |
| 1253.0 | 0 |
| 1252.0 | 0 |
| 1251.0 | 0 |
| 1250.0 | 0 |
| 1249.0 | 0 |
| 1248.0 | 0 |
| 1247.0 | 0 |
| 1246.0 | 0 |
| 1245.0 | 0 |
| 1244.0 | 0 |
| 1243.0 | 0 |
| 1242.0 | 0 |
| 1241.0 | 0 |
| 1240.0 | 0 |
| 1239.0 | 0 |
| 1238.0 | 0 |
| 1237.0 | 0 |
| 1236.0 | 0 |
| 1235.0 | 0 |
| 1234.0 | 0 |
| 1233.0 | 0 |
| 1232.0 | 0 |
| 1231.0 | 0 |
| 1230.0 | 0 |
| 1229.0 | 0 |
| 1228.0 | 0 |
| 1227.0 | 0 |
| 1226.0 | 0 |
| 1225.0 | 0 |
| 1224.0 | 0 |
| 1223.0 | 0 |
| 1222.0 | 0 |
| 1221.0 | 0 |
| 1220.0 | 0 |
| 1219.0 | 0 |
| 1218.0 | 0 |
| 1217.0 | 0 |
| 1216.0 | 0 |
| 1215.0 | 0 |
| 1214.0 | 0 |
| 1213.0 | 0 |
| 1212.0 | 0 |
| 1211.0 | 0 |
| 1210.0 | 0 |
| 1209.0 | 0 |
| 1208.0 | 0 |
| 1207.0 | 0 |
| 1206.0 | 0 |
| 1205.0 | 0 |
| 1204.0 | 0 |
| 1203.0 | 0 |
| 1202.0 | 0 |
| 1201.0 | 0 |
| 1200.0 | 0 |
| 1199.0 | 0 |
| 1198.0 | 0 |
| 1197.0 | 0 |
| 1196.0 | 0 |
| 1195.0 | 0 |
| 1194.0 | 0 |
| 1193.0 | 0 |
| 1192.0 | 0 |
| 1191.0 | 0 |
| 1190.0 | 0 |
| 1189.0 | 0 |
| 1188.0 | 0 |
| 1187.0 | 0 |
| 1186.0 | 0 |
| 1185.0 | 0 |
| 1184.0 | 0 |
| 1183.0 | 0 |
| 1182.0 | 0 |
| 1181.0 | 0 |
| 1180.0 | 0 |
| 1179.0 | 0 |
| 1178.0 | 0 |
| 1177.0 | 0 |
| 1176.0 | 0 |
| 1175.0 | 0 |
| 1174.0 | 0 |
| 1173.0 | 0 |
| 1172.0 | 0 |
| 1171.0 | 0 |
| 1170.0 | 0 |
| 1169.0 | 0 |
| 1168.0 | 0 |
| 1167.0 | 0 |
| 1166.0 | 0 |
| 1165.0 | 0 |
| 1164.0 | 0 |
| 1163.0 | 0 |
| 1162.0 | 0 |
| 1161.0 | 0 |
| 1160.0 | 0 |
| 1159.0 | 0 |
| 1158.0 | 0 |
| 1157.0 | 0 |
| 1156.0 | 0 |
| 1155.0 | 0 |
| 1154.0 | 0 |
| 1153.0 | 0 |
| 1152.0 | 0 |
| 1151.0 | 0 |
| 1150.0 | 0 |
| 1149.0 | 0 |
| 1148.0 | 0 |
| 1147.0 | 0 |
| 1146.0 | 0 |
| 1145.0 | 0 |
| 1144.0 | 0 |
| 1143.0 | 0 |
| 1142.0 | 0 |
| 1141.0 | 0 |
| 1140.0 | 0 |
| 1139.0 | 0 |
| 1138.0 | 0 |
| 1137.0 | 0 |
| 1136.0 | 0 |
| 1135.0 | 0 |
| 1134.0 | 0 |
| 1133.0 | 0 |
| 1132.0 | 0 |
| 1131.0 | 0 |
| 1130.0 | 0 |
| 1129.0 | 0 |
| 1128.0 | 0 |
| 1127.0 | 0 |
| 1126.0 | 0 |
| 1125.0 | 0 |
| 1124.0 | 0 |
| 1123.0 | 0 |
| 1122.0 | 0 |
| 1121.0 | 0 |
| 1120.0 | 0 |
| 1119.0 | 0 |
| 1118.0 | 0 |
| 1117.0 | 0 |
| 1116.0 | 0 |
| 1115.0 | 0 |
| 1114.0 | 0 |
| 1113.0 | 0 |
| 1112.0 | 0 |
| 1111.0 | 0 |
| 1110.0 | 0 |
| 1109.0 | 0 |
| 1108.0 | 0 |
| 1107.0 | 0 |
| 1106.0 | 0 |
| 1105.0 | 0 |
| 1104.0 | 0 |
| 1103.0 | 0 |
| 1102.0 | 0 |
| 1101.0 | 0 |
| 1100.0 | 0 |
| 1099.0 | 0 |
| 1098.0 | 0 |
| 1097.0 | 0 |
| 1096.0 | 0 |
| 1095.0 | 0 |
| 1094.0 | 0 |
| 1093.0 | 0 |
| 1092.0 | 0 |
| 1091.0 | 0 |
| 1090.0 | 0 |
| 1089.0 | 0 |
| 1088.0 | 0 |
| 1087.0 | 0 |
| 1086.0 | 0 |
| 1085.0 | 0 |
| 1084.0 | 0 |
| 1083.0 | 0 |
| 1082.0 | 0 |
| 1081.0 | 0 |
| 1080.0 | 0 |
| 1079.0 | 0 |
| 1078.0 | 0 |
| 1077.0 | 0 |
| 1076.0 | 0 |
| 1075.0 | 0 |
| 1074.0 | 0 |
| 1073.0 | 0 |
| 1072.0 | 0 |
| 1071.0 | 0 |
| 1070.0 | 0 |
| 1069.0 | 0 |
| 1068.0 | 0 |
| 1067.0 | 0 |
| 1066.0 | 0 |
| 1065.0 | 0 |
| 1064.0 | 0 |
| 1063.0 | 0 |
| 1062.0 | 0 |
| 1061.0 | 0 |
| 1060.0 | 0 |
| 1059.0 | 0 |
| 1058.0 | 0 |
| 1057.0 | 0 |
| 1056.0 | 0 |
| 1055.0 | 0 |
| 1054.0 | 0 |
| 1053.0 | 0 |
| 1052.0 | 0 |
| 1051.0 | 0 |
| 1050.0 | 0 |
| 1049.0 | 0 |
| 1048.0 | 0 |
| 1047.0 | 0 |
| 1046.0 | 0 |
| 1045.0 | 0 |
| 1044.0 | 0 |
| 1043.0 | 0 |
| 1042.0 | 0 |
| 1041.0 | 0 |
| 1040.0 | 0 |
| 1039.0 | 0 |
| 1038.0 | 0 |
| 1037.0 | 0 |
| 1036.0 | 0 |
| 1035.0 | 0 |
| 1034.0 | 0 |
| 1033.0 | 0 |
| 1032.0 | 0 |
| 1031.0 | 0 |
| 1030.0 | 0 |
| 1029.0 | 0 |
| 1028.0 | 0 |
| 1027.0 | 0 |
| 1026.0 | 0 |
| 1025.0 | 0 |
| 1024.0 | 0 |
| 1023.0 | 0 |
| 1022.0 | 0 |
| 1021.0 | 0 |
| 1020.0 | 0 |
| 1019.0 | 0 |
| 1018.0 | 0 |
| 1017.0 | 0 |
| 1016.0 | 0 |
| 1015.0 | 0 |
| 1014.0 | 0 |
| 1013.0 | 0 |
| 1012.0 | 0 |
| 1011.0 | 0 |
| 1010.0 | 0 |
| 1009.0 | 0 |
| 1008.0 | 0 |
| 1007.0 | 0 |
| 1006.0 | 0 |
| 1005.0 | 0 |
| 1004.0 | 0 |
| 1003.0 | 0 |
| 1002.0 | 0 |
| 1001.0 | 0 |
| 1000.0 | 0 |
| 999.0 | 0 |
| 998.0 | 0 |
| 997.0 | 0 |
| 996.0 | 0 |
| 995.0 | 0 |
| 994.0 | 0 |
| 993.0 | 0 |
| 992.0 | 0 |
| 991.0 | 0 |
| 990.0 | 0 |
| 989.0 | 0 |
| 988.0 | 0 |
| 987.0 | 0 |
| 986.0 | 0 |
| 985.0 | 0 |
| 984.0 | 0 |
| 983.0 | 0 |
| 982.0 | 0 |
| 981.0 | 0 |
| 980.0 | 0 |
| 979.0 | 0 |
| 978.0 | 0 |
| 977.0 | 0 |
| 976.0 | 0 |
| 975.0 | 0 |
| 974.0 | 0 |
| 973.0 | 0 |
| 972.0 | 0 |
| 971.0 | 0 |
| 970.0 | 0 |
| 969.0 | 0 |
| 968.0 | 0 |
| 967.0 | 0 |
| 966.0 | 0 |
| 965.0 | 0 |
| 964.0 | 0 |
| 963.0 | 0 |
| 962.0 | 0 |
| 961.0 | 0 |
| 960.0 | 0 |
| 959.0 | 0 |
| 958.0 | 0 |
| 957.0 | 0 |
| 956.0 | 0 |
| 955.0 | 0 |
| 954.0 | 0 |
| 953.0 | 0 |
| 952.0 | 0 |
| 951.0 | 0 |
| 950.0 | 0 |
| 949.0 | 0.001 |
| 948.0 | 0.001 |
| 947.0 | 0.001 |
| 946.0 | 0.001 |
| 945.0 | 0 |
| 944.0 | 0.001 |
| 943.0 | 0 |
| 942.0 | 0.001 |
| 941.0 | 0 |
| 940.0 | 0 |
| 939.0 | 0 |
| 938.0 | 0 |
| 937.0 | 0 |
| 936.0 | 0 |
| 935.0 | 0 |
| 934.0 | 0 |
| 933.0 | 0 |
| 932.0 | 0.001 |
| 931.0 | 0 |
| 930.0 | 0 |
| 929.0 | 0 |
| 928.0 | 0 |
| 927.0 | 0 |
| 926.0 | 0 |
| 925.0 | 0 |
| 924.0 | 0 |
| 923.0 | 0 |
| 922.0 | 0 |
| 921.0 | 0 |
| 920.0 | 0 |
| 919.0 | 0 |
| 918.0 | 0 |
| 917.0 | 0 |
| 916.0 | 0 |
| 915.0 | 0 |
| 914.0 | 0 |
| 913.0 | 0 |
| 912.0 | 0 |
| 911.0 | 0 |
| 910.0 | 0 |
| 909.0 | 0 |
| 908.0 | 0 |
| 907.0 | 0 |
| 906.0 | 0 |
| 905.0 | 0 |
| 904.0 | 0 |
| 903.0 | 0 |
| 902.0 | 0 |
| 901.0 | 0 |
| 900.0 | 0 |
| 899.0 | 0 |
| 898.0 | 0 |
| 897.0 | 0 |
| 896.0 | 0 |
| 895.0 | 0 |
| 894.0 | 0 |
| 893.0 | 0 |
| 892.0 | 0 |
| 891.0 | 0 |
| 890.0 | 0 |
| 889.0 | 0 |
| 888.0 | 0 |
| 887.0 | 0 |
| 886.0 | 0 |
| 885.0 | 0 |
| 884.0 | 0 |
| 883.0 | 0 |
| 882.0 | 0 |
| 881.0 | 0 |
| 880.0 | 0 |
| 879.0 | 0 |
| 878.0 | 0 |
| 877.0 | 0 |
| 876.0 | 0 |
| 875.0 | 0 |
| 874.0 | 0 |
| 873.0 | 0 |
| 872.0 | 0 |
| 871.0 | 0 |
| 870.0 | 0 |
| 869.0 | 0 |
| 868.0 | 0 |
| 867.0 | 0 |
| 866.0 | 0 |
| 865.0 | 0 |
| 864.0 | 0 |
| 863.0 | 0 |
| 862.0 | 0 |
| 861.0 | 0 |
| 860.0 | 0 |
| 859.0 | 0 |
| 858.0 | 0 |
| 857.0 | 0 |
| 856.0 | 0 |
| 855.0 | 0 |
| 854.0 | 0 |
| 853.0 | 0 |
| 852.0 | 0 |
| 851.0 | 0 |
| 850.0 | 0 |
| 849.0 | 0 |
| 848.0 | 0 |
| 847.0 | 0 |
| 846.0 | 0 |
| 845.0 | 0 |
| 844.0 | 0 |
| 843.0 | 0 |
| 842.0 | 0 |
| 841.0 | 0 |
| 840.0 | 0 |
| 839.0 | 0 |
| 838.0 | 0 |
| 837.0 | 0 |
| 836.0 | 0 |
| 835.0 | 0 |
| 834.0 | 0 |
| 833.0 | 0 |
| 832.0 | 0 |
| 831.0 | 0 |
| 830.0 | 0 |
| 829.0 | 0 |
| 828.0 | 0 |
| 827.0 | 0 |
| 826.0 | 0 |
| 825.0 | 0 |
| 824.0 | 0 |
| 823.0 | 0 |
| 822.0 | 0 |
| 821.0 | 0 |
| 820.0 | 0 |
| 819.0 | 0 |
| 818.0 | 0 |
| 817.0 | 0 |
| 816.0 | -0.001 |
| 815.0 | 0 |
| 814.0 | 0 |
| 813.0 | 0 |
| 812.0 | 0 |
| 811.0 | 0 |
| 810.0 | 0 |
| 809.0 | 0 |
| 808.0 | -0.001 |
| 807.0 | -0.001 |
| 806.0 | 0 |
| 805.0 | 0 |
| 804.0 | 0 |
| 803.0 | 0 |
| 802.0 | 0 |
| 801.0 | 0 |
| 800.0 | 0 |
| 799.0 | 0 |
| 798.0 | 0 |
| 797.0 | 0 |
| 796.0 | 0 |
| 795.0 | 0 |
| 794.0 | 0 |
| 793.0 | 0 |
| 792.0 | 0 |
| 791.0 | 0 |
| 790.0 | 0 |
| 789.0 | 0 |
| 788.0 | 0 |
| 787.0 | 0 |
| 786.0 | 0 |
| 785.0 | 0 |
| 784.0 | 0 |
| 783.0 | 0 |
| 782.0 | 0 |
| 781.0 | 0 |
| 780.0 | 0 |
| 779.0 | 0 |
| 778.0 | 0 |
| 777.0 | 0 |
| 776.0 | 0 |
| 775.0 | 0 |
| 774.0 | 0 |
| 773.0 | 0 |
| 772.0 | 0 |
| 771.0 | 0 |
| 770.0 | 0 |
| 769.0 | 0 |
| 768.0 | 0 |
| 767.0 | 0 |
| 766.0 | 0 |
| 765.0 | 0 |
| 764.0 | 0 |
| 763.0 | 0 |
| 762.0 | 0 |
| 761.0 | 0 |
| 760.0 | 0 |
| 759.0 | 0 |
| 758.0 | 0 |
| 757.0 | 0 |
| 756.0 | 0 |
| 755.0 | 0.001 |
| 754.0 | 0.001 |
| 753.0 | 0.001 |
| 752.0 | 0.001 |
| 751.0 | 0.001 |
| 750.0 | 0 |
| 749.0 | 0 |
| 748.0 | 0 |
| 747.0 | 0 |
| 746.0 | 0 |
| 745.0 | 0 |
| 744.0 | 0 |
| 743.0 | 0 |
| 742.0 | 0.001 |
| 741.0 | 0.001 |
| 740.0 | 0.001 |
| 739.0 | 0.002 |
| 738.0 | 0.003 |
| 737.0 | 0.003 |
| 736.0 | 0.003 |
| 735.0 | 0.002 |
| 734.0 | 0.001 |
| 733.0 | 0.001 |
| 732.0 | 0.001 |
| 731.0 | 0.001 |
| 730.0 | 0.001 |
| 729.0 | 0.001 |
| 728.0 | 0.001 |
| 727.0 | 0.001 |
| 726.0 | 0.001 |
| 725.0 | 0.001 |
| 724.0 | 0.001 |
| 723.0 | 0.001 |
| 722.0 | 0.002 |
| 721.0 | 0.002 |
| 720.0 | 0.002 |
| 719.0 | 0.002 |
| 718.0 | 0.001 |
| 717.0 | 0.001 |
| 716.0 | 0.001 |
| 715.0 | 0.001 |
| 714.0 | 0.001 |
| 713.0 | 0 |
| 712.0 | 0 |
| 711.0 | 0 |
| 710.0 | 0 |
| 709.0 | 0 |
| 708.0 | 0 |
| 707.0 | 0 |
| 706.0 | 0 |
| 705.0 | 0 |
| 704.0 | 0 |
| 703.0 | 0 |
| 702.0 | 0 |
| 701.0 | 0.001 |
| 700.0 | 0.001 |
| 699.0 | 0.001 |
| 698.0 | 0.001 |
| 697.0 | 0.001 |
| 696.0 | 0.001 |
| 695.0 | 0.001 |
| 694.0 | 0 |
| 693.0 | 0 |
| 692.0 | 0 |
| 691.0 | 0 |
| 690.0 | 0 |
| 689.0 | 0 |
| 688.0 | 0 |
| 687.0 | 0 |
| 686.0 | 0 |
| 685.0 | 0 |
| 684.0 | 0 |
| 683.0 | 0 |
| 682.0 | 0 |
| 681.0 | 0 |
| 680.0 | 0 |
| 679.0 | 0 |
| 678.0 | 0 |
| 677.0 | 0 |
| 676.0 | 0 |
| 675.0 | 0 |
| 674.0 | 0 |
| 673.0 | 0 |
| 672.0 | 0 |
| 671.0 | 0 |
| 670.0 | 0 |
| 669.0 | 0 |
| 668.0 | 0 |
| 667.0 | 0 |
| 666.0 | 0 |
| 665.0 | 0 |
| 664.0 | 0 |
| 663.0 | 0 |
| 662.0 | 0 |
| 661.0 | 0 |
| 660.0 | 0 |
| 659.0 | 0 |
| 658.0 | 0 |
| 657.0 | 0 |
| 656.0 | 0 |
| 655.0 | 0 |
| 654.0 | 0 |
| 653.0 | 0 |
| 652.0 | 0 |
| 651.0 | 0 |
| 650.0 | 0 |
| 649.0 | 0 |
| 648.0 | 0 |
| 647.0 | 0 |
| 646.0 | 0 |
| 645.0 | 0 |
| 644.0 | 0 |
| 643.0 | 0 |
| 642.0 | 0 |
| 641.0 | 0 |
| 640.0 | 0 |
| 639.0 | 0 |
| 638.0 | 0 |
| 637.0 | 0 |
| 636.0 | 0 |
| 635.0 | 0 |
| 634.0 | 0 |
| 633.0 | 0 |
| 632.0 | 0 |
| 631.0 | 0 |
| 630.0 | 0 |
| 629.0 | 0 |
| 628.0 | 0 |
| 627.0 | 0 |
| 626.0 | 0 |
| 625.0 | 0 |
| 624.0 | 0 |
| 623.0 | 0 |
| 622.0 | 0 |
| 621.0 | 0 |
| 620.0 | 0 |
| 619.0 | 0 |
| 618.0 | 0 |
| 617.0 | 0 |
| 616.0 | 0 |
| 615.0 | 0 |
| 614.0 | 0 |
| 613.0 | 0 |
| 612.0 | 0 |
| 611.0 | 0 |
| 610.0 | 0 |
| 609.0 | 0 |
| 608.0 | 0 |
| 607.0 | 0 |
| 606.0 | 0 |
| 605.0 | 0 |
| 604.0 | 0 |
| 603.0 | 0 |
| 602.0 | 0 |
| 601.0 | 0 |
| 600.0 | 0 |
| 599.0 | 0 |
| 598.0 | 0 |
| 597.0 | 0 |
| 596.0 | 0 |
| 595.0 | 0 |
| 594.0 | 0 |
| 593.0 | 0 |
| 592.0 | 0 |
| 591.0 | 0 |
| 590.0 | 0 |
| 589.0 | 0 |
| 588.0 | 0 |
| 587.0 | 0 |
| 586.0 | 0 |
| 585.0 | 0 |
| 584.0 | 0 |
| 583.0 | 0 |
| 582.0 | 0 |
| 581.0 | 0 |
| 580.0 | 0 |
| 579.0 | 0 |
| 578.0 | 0 |
| 577.0 | 0 |
| 576.0 | 0 |
| 575.0 | 0 |
| 574.0 | 0 |
| 573.0 | 0 |
| 572.0 | 0 |
| 571.0 | 0 |
| 570.0 | 0 |
| 569.0 | 0 |
| 568.0 | 0 |
| 567.0 | 0 |
| 566.0 | 0 |
| 565.0 | 0 |
| 564.0 | 0 |
| 563.0 | 0 |
| 562.0 | 0 |
| 561.0 | 0 |
| 560.0 | 0 |
| 559.0 | 0 |
| 558.0 | 0 |
| 557.0 | 0 |
| 556.0 | 0 |
| 555.0 | 0 |
| 554.0 | 0 |
| 553.0 | 0 |
| 552.0 | 0 |
| 551.0 | 0 |
| 550.0 | 0 |
| 549.0 | 0 |
| 548.0 | 0 |
| 547.0 | 0 |
| 546.0 | 0 |
| 545.0 | 0 |
| 544.0 | 0 |
| 543.0 | 0 |
| 542.0 | 0 |
| 541.0 | 0 |
| 540.0 | 0 |
| 539.0 | 0 |
| 538.0 | 0 |
| 537.0 | 0 |
| 536.0 | 0 |
| 535.0 | 0 |
| 534.0 | 0 |
| 533.0 | 0 |
| 532.0 | 0 |
| 531.0 | 0 |
| 530.0 | 0 |
| 529.0 | 0 |
| 528.0 | 0 |
| 527.0 | 0 |
| 526.0 | 0 |
| 525.0 | 0 |
| 524.0 | 0 |
| 523.0 | 0 |
| 522.0 | 0 |
| 521.0 | 0 |
| 520.0 | 0 |
| 519.0 | 0 |
| 518.0 | 0 |
| 517.0 | 0 |
| 516.0 | 0 |
| 515.0 | 0 |
| 514.0 | 0 |
| 513.0 | 0 |
| 512.0 | 0 |
| 511.0 | 0 |
| 510.0 | 0 |
| 509.0 | 0 |
| 508.0 | 0 |
| 507.0 | 0 |
| 506.0 | 0 |
| 505.0 | 0 |
| 504.0 | 0 |
| 503.0 | 0 |
| 502.0 | 0 |
| 501.0 | 0 |
| 500.0 | 0 |
| 499.0 | 0 |
| 498.0 | 0 |
| 497.0 | 0 |
| 496.0 | 0 |
| 495.0 | 0 |
| 494.0 | 0 |
| 493.0 | 0 |
| 492.0 | 0 |
| 491.0 | 0 |
| 490.0 | 0 |
| 489.0 | 0 |
| 488.0 | 0 |
| 487.0 | 0 |
| 486.0 | 0 |
| 485.0 | 0 |
| 484.0 | 0 |
| 483.0 | 0 |
| 482.0 | 0 |
| 481.0 | 0 |
| 480.0 | 0 |
| 479.0 | 0 |
| 478.0 | 0 |
| 477.0 | 0 |
| 476.0 | 0 |
| 475.0 | 0 |
| 474.0 | 0 |
| 473.0 | 0 |
| 472.0 | 0 |
| 471.0 | 0 |
| 470.0 | 0 |
| 469.0 | 0 |
| 468.0 | 0 |
| 467.0 | 0 |
| 466.0 | 0 |
| 465.0 | 0 |
| 464.0 | 0 |
| 463.0 | 0 |
| 462.0 | 0 |
| 461.0 | 0 |
| 460.0 | 0 |
| 459.0 | 0 |
| 458.0 | 0 |
| 457.0 | 0 |
| 456.0 | 0 |
| 455.0 | 0 |
| 454.0 | 0 |
| 453.0 | 0 |
| 452.0 | 0 |
| 451.0 | 0 |
| 450.0 | 0 |
| 449.0 | 0 |
| 448.0 | 0 |
| 447.0 | 0 |
| 446.0 | 0 |
| 445.0 | 0 |
| 444.0 | 0 |
| 443.0 | 0 |
| 442.0 | 0 |
| 441.0 | 0 |
| 440.0 | 0 |
| 439.0 | 0 |
| 438.0 | 0 |
| 437.0 | 0 |
| 436.0 | 0 |
| 435.0 | 0 |
| 434.0 | 0 |
| 433.0 | 0 |
| 432.0 | 0 |
| 431.0 | 0 |
| 430.0 | 0 |
| 429.0 | 0 |
| 428.0 | 0 |
| 427.0 | 0 |
| 426.0 | 0 |
| 425.0 | 0 |
| 424.0 | 0 |
| 423.0 | 0 |
| 422.0 | 0 |
| 421.0 | 0 |
| 420.0 | 0 |
| 419.0 | 0 |
| 418.0 | 0 |
| 417.0 | 0 |
| 416.0 | 0 |
| 415.0 | 0 |
| 414.0 | 0 |
| 413.0 | 0 |
| 412.0 | 0 |
| 411.0 | 0 |
| 410.0 | 0 |
| 409.0 | 0 |
| 408.0 | 0 |
| 407.0 | 0 |
| 406.0 | 0 |
| 405.0 | 0 |
| 404.0 | 0 |
| 403.0 | 0 |
| 402.0 | 0 |
| 401.0 | 0 |
| 400.0 | 0 |
| 399.0 | 0 |
| 398.0 | 0 |
| 397.0 | 0 |
| 396.0 | 0 |
| 395.0 | 0 |
| 394.0 | 0 |
| 393.0 | 0 |
| 392.0 | 0 |
| 391.0 | 0 |
| 390.0 | 0 |
| 389.0 | 0 |
| 388.0 | 0 |
| 387.0 | 0 |
| 386.0 | 0 |
| 385.0 | 0 |
| 384.0 | 0 |
| 383.0 | 0 |
| 382.0 | 0 |
| 381.0 | 0 |
| 380.0 | 0 |
| 379.0 | 0 |
| 378.0 | 0 |
| 377.0 | 0 |
| 376.0 | 0 |
| 375.0 | 0 |
| 374.0 | 0 |
| 373.0 | 0 |
| 372.0 | 0 |
| 371.0 | 0 |
| 370.0 | 0 |
| 369.0 | 0 |
| 368.0 | 0 |
| 367.0 | 0 |
| 366.0 | 0 |
| 365.0 | 0 |
| 364.0 | 0 |
| 363.0 | 0 |
| 362.0 | 0 |
| 361.0 | 0 |
| 360.0 | 0 |
| 359.0 | 0 |
| 358.0 | 0 |
| 357.0 | 0 |
| 356.0 | 0 |
| 355.0 | 0 |
| 354.0 | 0 |
| 353.0 | 0 |
| 352.0 | 0 |
| 351.0 | 0 |
| 350.0 | 0 |
| 349.0 | 0 |
| 348.0 | 0 |
| 347.0 | 0 |
| 346.0 | 0 |
| 345.0 | 0 |
| 344.0 | 0 |
| 343.0 | 0 |
| 342.0 | 0 |
| 341.0 | 0 |
| 340.0 | 0 |
| 339.0 | 0 |
| 338.0 | 0 |
| 337.0 | 0 |
| 336.0 | 0 |
| 335.0 | 0 |
| 334.0 | 0 |
| 333.0 | 0 |
| 332.0 | 0 |
| 331.0 | 0 |
| 330.0 | 0 |
| 329.0 | 0 |
| 328.0 | 0 |
| 327.0 | 0 |
| 326.0 | 0 |
| 325.0 | 0 |
| 324.0 | 0 |
| 323.0 | 0 |
| 322.0 | 0 |
| 321.0 | 0 |
| 320.0 | 0 |
| 319.0 | 0 |
| 318.0 | 0 |
| 317.0 | 0 |
| 316.0 | 0 |
| 315.0 | 0 |
| 314.0 | 0 |
| 313.0 | 0 |
| 312.0 | 0 |
| 311.0 | 0 |
| 310.0 | 0 |
| 309.0 | 0 |
| 308.0 | 0 |
| 307.0 | 0 |
| 306.0 | 0 |
| 305.0 | 0 |
| 304.0 | 0 |
| 303.0 | 0 |
| 302.0 | 0 |
| 301.0 | 0 |
| 300.0 | 0 |
| 299.0 | 0 |
| 298.0 | 0 |
| 297.0 | 0 |
| 296.0 | 0 |
| 295.0 | 0 |
| 294.0 | 0 |
| 293.0 | 0 |
| 292.0 | 0 |
| 291.0 | 0 |
| 290.0 | 0 |
| 289.0 | 0 |
| 288.0 | 0 |
| 287.0 | 0 |
| 286.0 | 0 |
| 285.0 | 0 |
| 284.0 | 0 |
| 283.0 | 0 |
| 282.0 | 0 |
| 281.0 | 0 |
| 280.0 | 0 |
| 279.0 | 0 |
| 278.0 | 0 |
| 277.0 | 0 |
| 276.0 | 0 |
| 275.0 | 0 |
| 274.0 | 0 |
| 273.0 | 0 |
| 272.0 | 0 |
| 271.0 | 0 |
| 270.0 | 0 |
| 269.0 | 0 |
| 268.0 | 0 |
| 267.0 | 0 |
| 266.0 | 0 |
| 265.0 | 0 |
| 264.0 | 0 |
| 263.0 | 0 |
| 262.0 | 0 |
| 261.0 | 0 |
| 260.0 | 0 |
| 259.0 | 0 |
| 258.0 | 0 |
| 257.0 | 0 |
| 256.0 | 0 |
| 255.0 | 0 |
| 254.0 | 0 |
| 253.0 | 0 |
| 252.0 | 0 |
| 251.0 | 0 |
| 250.0 | 0 |
| 249.0 | 0 |
| 248.0 | 0 |
| 247.0 | 0 |
| 246.0 | 0 |
| 245.0 | 0 |
| 244.0 | 0 |
| 243.0 | 0 |
| 242.0 | 0 |
| 241.0 | 0 |
| 240.0 | 0 |
| 239.0 | 0 |
| 238.0 | 0 |
| 237.0 | 0 |
| 236.0 | 0 |
| 235.0 | 0 |
| 234.0 | 0 |
| 233.0 | 0 |
| 232.0 | 0 |
| 231.0 | 0 |
| 230.0 | 0 |
| 229.0 | 0 |
| 228.0 | 0 |
| 227.0 | 0 |
| 226.0 | 0 |
| 225.0 | 0 |
| 224.0 | 0 |
| 223.0 | 0 |
| 222.0 | 0 |
| 221.0 | 0 |
| 220.0 | 0 |
| 219.0 | 0 |
| 218.0 | 0 |
| 217.0 | 0 |